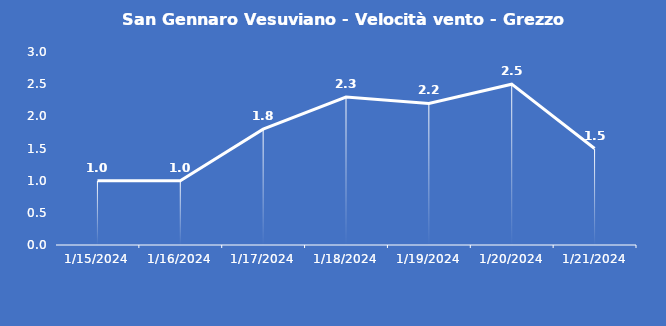
| Category | San Gennaro Vesuviano - Velocità vento - Grezzo (m/s) |
|---|---|
| 1/15/24 | 1 |
| 1/16/24 | 1 |
| 1/17/24 | 1.8 |
| 1/18/24 | 2.3 |
| 1/19/24 | 2.2 |
| 1/20/24 | 2.5 |
| 1/21/24 | 1.5 |